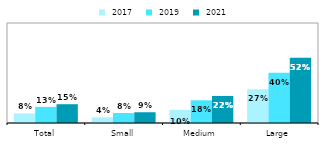
| Category |  2017 |  2019 |  2021 |
|---|---|---|---|
| Total | 0.076 | 0.129 | 0.15 |
| Small | 0.045 | 0.08 | 0.086 |
| Medium | 0.105 | 0.182 | 0.216 |
| Large | 0.27 | 0.403 | 0.521 |